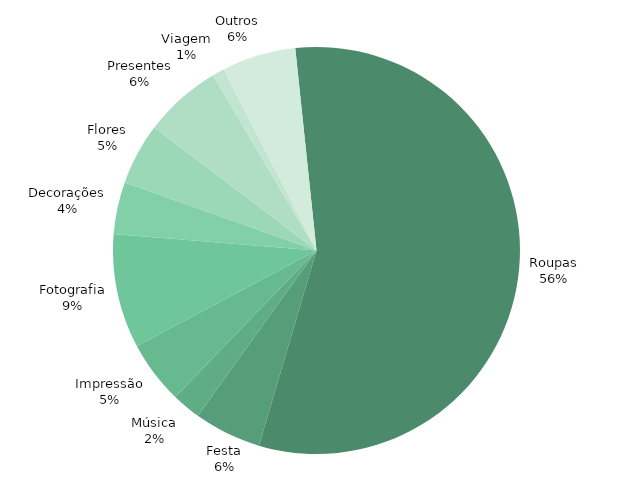
| Category | REAL |
|---|---|
| Roupas | 9770 |
| Festa | 928 |
| Música | 400 |
| Impressão | 870 |
| Fotografia | 1575 |
| Decorações | 720 |
| Flores | 850 |
| Presentes | 1075 |
| Viagem | 165 |
| Outros | 1021 |